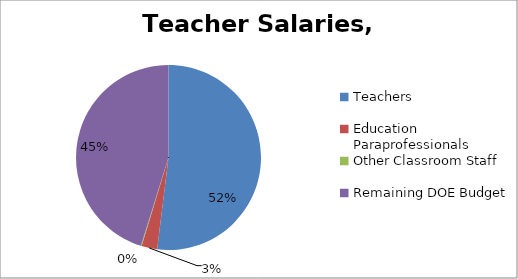
| Category | Series 0 |
|---|---|
| Teachers  | 6862 |
| Education Paraprofessionals  | 362 |
| Other Classroom Staff  | 16 |
| Remaining DOE Budget | 5967 |